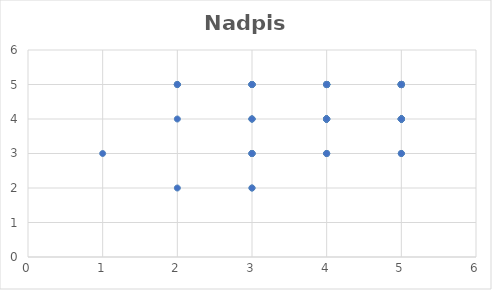
| Category | Series 0 |
|---|---|
| 2.0 | 2 |
| 3.0 | 2 |
| 3.0 | 3 |
| 3.0 | 5 |
| 3.0 | 3 |
| 4.0 | 3 |
| 5.0 | 4 |
| 2.0 | 5 |
| 1.0 | 3 |
| 2.0 | 4 |
| 3.0 | 4 |
| 3.0 | 4 |
| 3.0 | 5 |
| 5.0 | 5 |
| 2.0 | 5 |
| 2.0 | 5 |
| 4.0 | 5 |
| 4.0 | 5 |
| 3.0 | 3 |
| 3.0 | 3 |
| 4.0 | 3 |
| 4.0 | 4 |
| 5.0 | 4 |
| 4.0 | 5 |
| 4.0 | 5 |
| 5.0 | 5 |
| 3.0 | 5 |
| 3.0 | 4 |
| 4.0 | 4 |
| 4.0 | 5 |
| 4.0 | 3 |
| 4.0 | 4 |
| 3.0 | 5 |
| 5.0 | 5 |
| 4.0 | 5 |
| 3.0 | 4 |
| 4.0 | 5 |
| 4.0 | 5 |
| 5.0 | 5 |
| 5.0 | 5 |
| 4.0 | 5 |
| 5.0 | 5 |
| 5.0 | 4 |
| 4.0 | 5 |
| 5.0 | 5 |
| 5.0 | 4 |
| 5.0 | 4 |
| 4.0 | 5 |
| 5.0 | 5 |
| 5.0 | 4 |
| 5.0 | 4 |
| 5.0 | 5 |
| 2.0 | 5 |
| 5.0 | 5 |
| 5.0 | 5 |
| 5.0 | 5 |
| 5.0 | 5 |
| 4.0 | 5 |
| 4.0 | 4 |
| 5.0 | 3 |
| 5.0 | 5 |
| 5.0 | 5 |
| 5.0 | 5 |
| 4.0 | 4 |
| 4.0 | 5 |
| 5.0 | 5 |
| 4.0 | 5 |
| 4.0 | 4 |
| 5.0 | 4 |
| 4.0 | 5 |
| 5.0 | 5 |
| 4.0 | 5 |
| 3.0 | 2 |
| 5.0 | 4 |
| 3.0 | 5 |
| 5.0 | 5 |
| 5.0 | 5 |
| 5.0 | 5 |
| 5.0 | 5 |
| 5.0 | 5 |
| 4.0 | 4 |
| 4.0 | 4 |
| 4.0 | 5 |
| 4.0 | 5 |
| 3.0 | 5 |
| 4.0 | 5 |
| 5.0 | 5 |
| 4.0 | 4 |
| 4.0 | 4 |
| 5.0 | 5 |
| 5.0 | 5 |
| 5.0 | 4 |
| 5.0 | 4 |
| 5.0 | 5 |
| 5.0 | 5 |
| 5.0 | 5 |
| 5.0 | 5 |
| 5.0 | 5 |
| 4.0 | 3 |
| 5.0 | 3 |
| 4.0 | 4 |
| 4.0 | 4 |
| 4.0 | 5 |
| 4.0 | 5 |
| 5.0 | 5 |
| 5.0 | 5 |
| 5.0 | 5 |
| 5.0 | 5 |
| 5.0 | 5 |
| 5.0 | 4 |
| 5.0 | 4 |
| 5.0 | 5 |
| 5.0 | 5 |
| 5.0 | 3 |
| 5.0 | 4 |
| 5.0 | 4 |
| 5.0 | 5 |
| 5.0 | 5 |
| 5.0 | 5 |
| 5.0 | 5 |
| 5.0 | 5 |
| 5.0 | 5 |
| 5.0 | 5 |
| 4.0 | 5 |
| 5.0 | 5 |
| 5.0 | 5 |